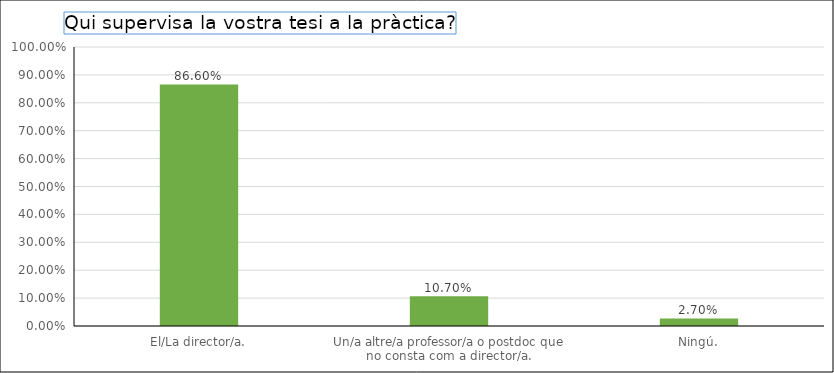
| Category | Series 0 |
|---|---|
| El/La director/a. | 0.866 |
| Un/a altre/a professor/a o postdoc que no consta com a director/a. | 0.107 |
| Ningú. | 0.027 |